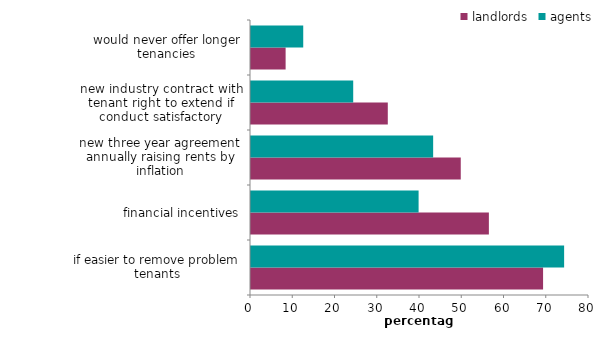
| Category | landlords | agents |
|---|---|---|
| if easier to remove problem tenants | 69.131 | 74.113 |
| financial incentives | 56.302 | 39.668 |
| new three year agreement annually raising rents by inflation | 49.647 | 43.113 |
| new industry contract with tenant right to extend if conduct satisfactory | 32.377 | 24.192 |
| would never offer longer tenancies | 8.193 | 12.364 |